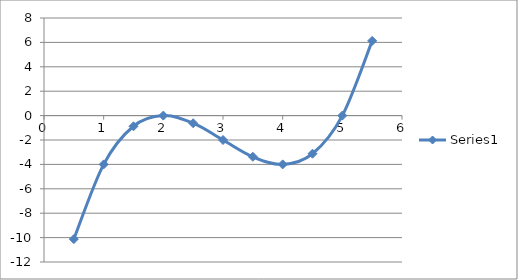
| Category | Series 0 |
|---|---|
| 0.5 | -10.125 |
| 1.0 | -4 |
| 1.5 | -0.875 |
| 2.0 | 0 |
| 2.5 | -0.625 |
| 3.0 | -2 |
| 3.5 | -3.375 |
| 4.0 | -4 |
| 4.5 | -3.125 |
| 5.0 | 0 |
| 5.5 | 6.125 |